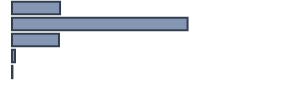
| Category | Series 0 |
|---|---|
| 0 | 17.541 |
| 1 | 64.069 |
| 2 | 17.14 |
| 3 | 1.095 |
| 4 | 0.155 |